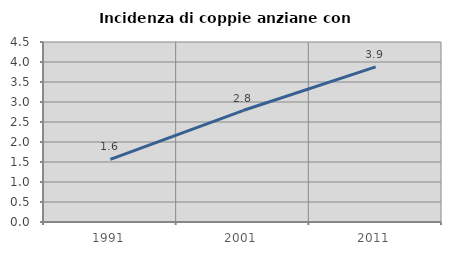
| Category | Incidenza di coppie anziane con figli |
|---|---|
| 1991.0 | 1.565 |
| 2001.0 | 2.787 |
| 2011.0 | 3.878 |